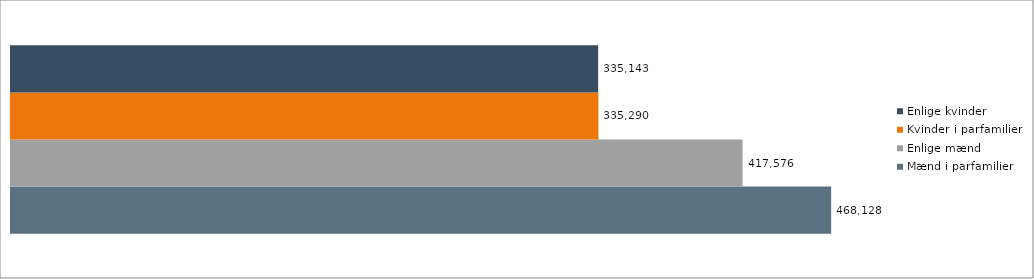
| Category | Mænd i parfamilier | Enlige mænd | Kvinder i parfamilier | Enlige kvinder |
|---|---|---|---|---|
| 0 | 468128 | 417576 | 335290 | 335143 |